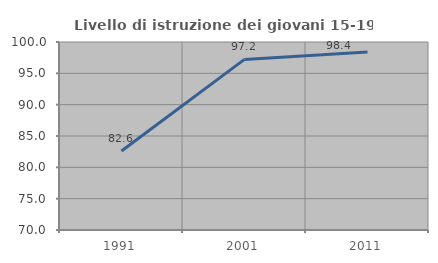
| Category | Livello di istruzione dei giovani 15-19 anni |
|---|---|
| 1991.0 | 82.609 |
| 2001.0 | 97.222 |
| 2011.0 | 98.387 |